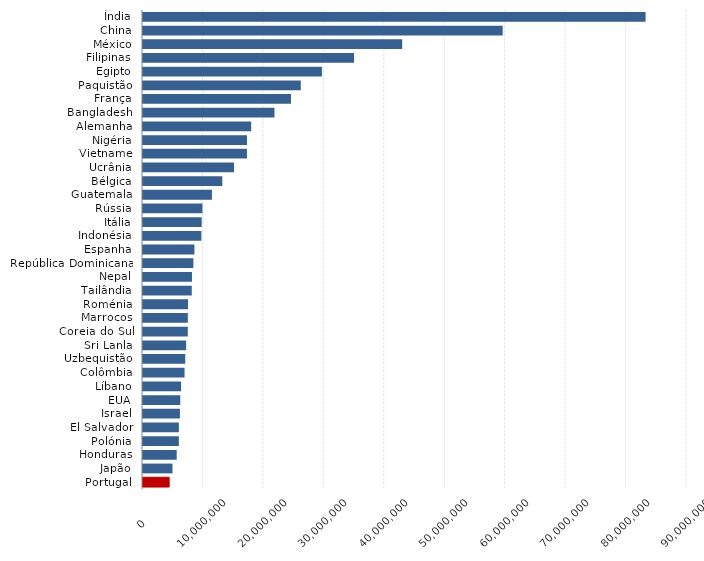
| Category | Series 0 |
|---|---|
| Índia | 83149000 |
| China | 59506673.349 |
| México | 42880323.453 |
| Filipinas | 34913342.999 |
| Egipto | 29602900 |
| Paquistão | 26105000 |
| França | 24481658.776 |
| Bangladesh | 21749701.161 |
| Alemanha | 17898798.739 |
| Nigéria | 17207547.306 |
| Vietname | 17200000 |
| Ucrânia | 15054000 |
| Bélgica | 13120861.704 |
| Guatemala | 11402842.29 |
| Rússia | 9836320 |
| Itália | 9711242.183 |
| Indonésia | 9650926.142 |
| Espanha | 8509105.652 |
| República Dominicana | 8331600 |
| Nepal | 8101574.298 |
| Tailândia | 8067219.205 |
| Roménia | 7446920.974 |
| Marrocos | 7418557.947 |
| Coreia do Sul | 7412800 |
| Sri Lanla | 7140000 |
| Uzbequistão | 6989309.838 |
| Colômbia | 6873553.689 |
| Líbano | 6298422.3 |
| EUA | 6166000 |
| Israel | 6106000 |
| El Salvador | 5936157.615 |
| Polónia | 5930000 |
| Honduras | 5576000 |
| Japão | 4875181.074 |
| Portugal | 4326917.07 |